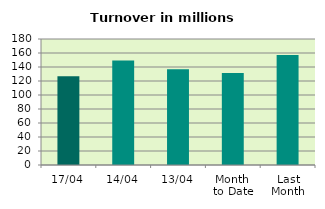
| Category | Series 0 |
|---|---|
| 17/04 | 126.739 |
| 14/04 | 149.347 |
| 13/04 | 136.905 |
| Month 
to Date | 131.475 |
| Last
Month | 157.238 |